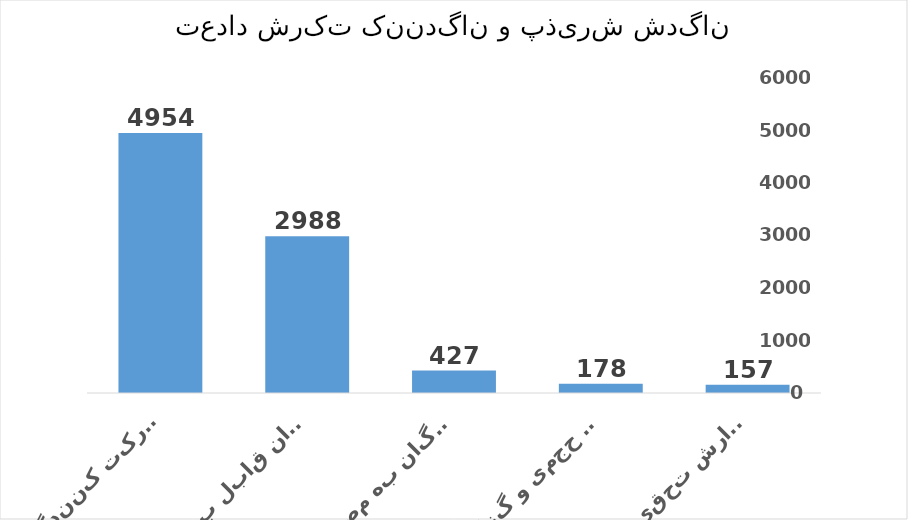
| Category | Series 0 |
|---|---|
| تایید به منظور تهیه نمونه گزارش تحقیقاتی | 157 |
| پذیرش به صورت قرارداد حجمی و گزارشی | 178 |
| تعداد دعوت‌شدگان به مصاحبه | 427 |
| تعداد شركت‌كنندگان قابل بررسی | 2988 |
| مجموع شرکت کنندگان | 4954 |